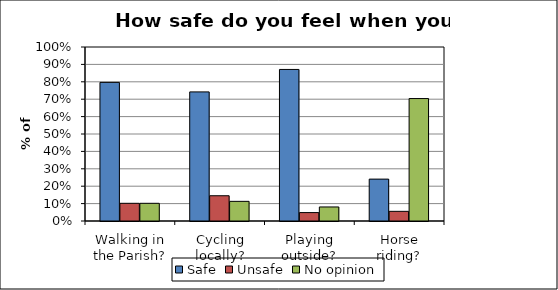
| Category | Safe | Unsafe | No opinion |
|---|---|---|---|
| Walking in the Parish? | 0.797 | 0.102 | 0.102 |
| Cycling locally? | 0.742 | 0.145 | 0.113 |
| Playing outside? | 0.871 | 0.048 | 0.081 |
| Horse riding? | 0.241 | 0.056 | 0.704 |